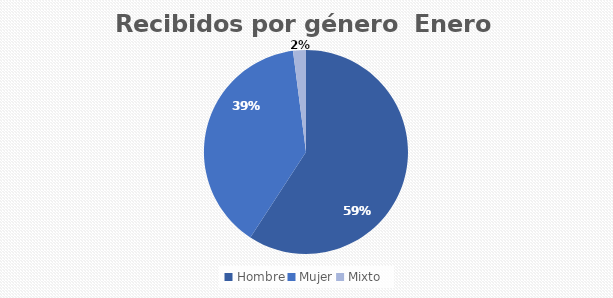
| Category | Recibidos por género  ENERO |
|---|---|
| Hombre | 29 |
| Mujer | 19 |
| Mixto | 1 |